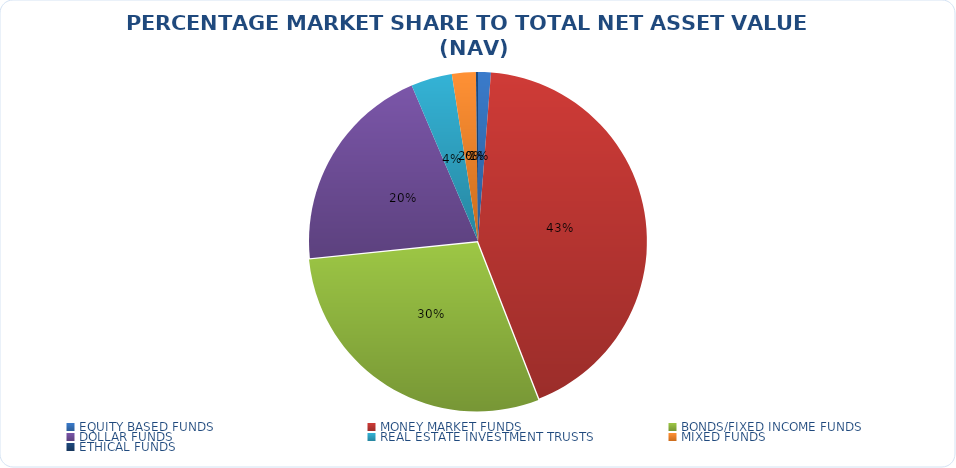
| Category | NET ASSET VALUE |
|---|---|
| EQUITY BASED FUNDS | 15604456768.67 |
| MONEY MARKET FUNDS | 546435351786.047 |
| BONDS/FIXED INCOME FUNDS | 373276764567.33 |
| DOLLAR FUNDS | 257437121498.54 |
| REAL ESTATE INVESTMENT TRUSTS | 50174917751.98 |
| MIXED FUNDS | 29120838802.455 |
| ETHICAL FUNDS | 2494659000.9 |